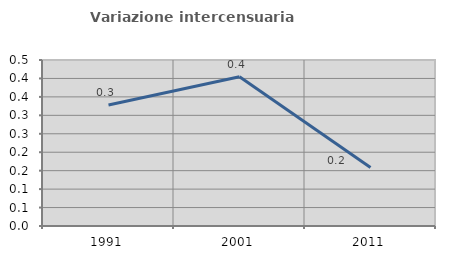
| Category | Variazione intercensuaria annua |
|---|---|
| 1991.0 | 0.328 |
| 2001.0 | 0.405 |
| 2011.0 | 0.159 |